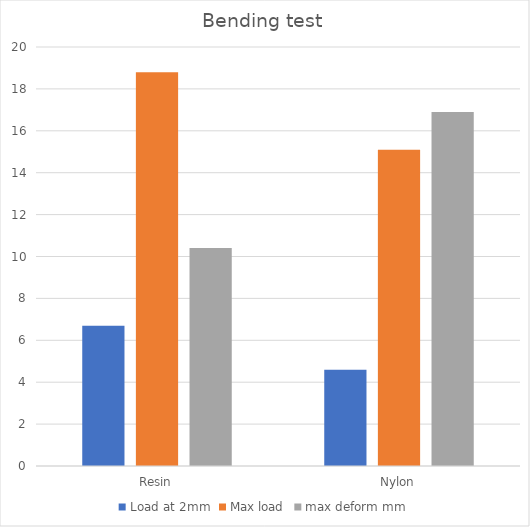
| Category | Load at 2mm | Max load | max deform mm |
|---|---|---|---|
| Resin | 6.7 | 18.8 | 10.4 |
| Nylon | 4.6 | 15.1 | 16.9 |